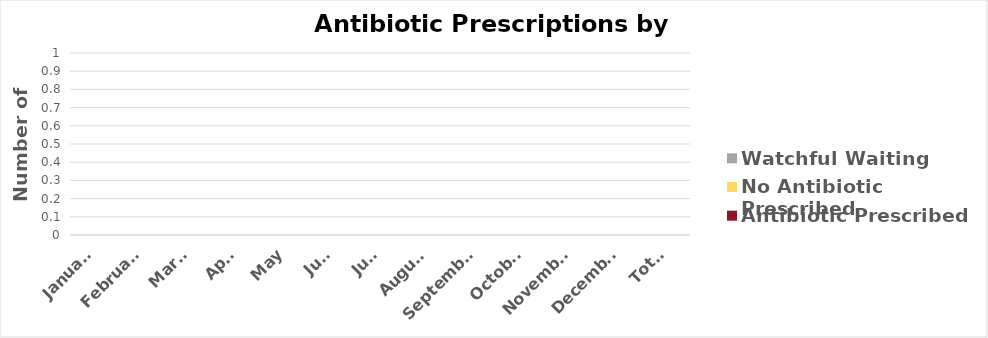
| Category | Antibiotic Prescribed | No Antibiotic Prescribed | Watchful Waiting |
|---|---|---|---|
| January | 0 | 0 | 0 |
| February | 0 | 0 | 0 |
| March | 0 | 0 | 0 |
| April | 0 | 0 | 0 |
| May | 0 | 0 | 0 |
| June | 0 | 0 | 0 |
| July | 0 | 0 | 0 |
| August | 0 | 0 | 0 |
| September | 0 | 0 | 0 |
| October | 0 | 0 | 0 |
| November | 0 | 0 | 0 |
| December  | 0 | 0 | 0 |
| Total  | 0 | 0 | 0 |